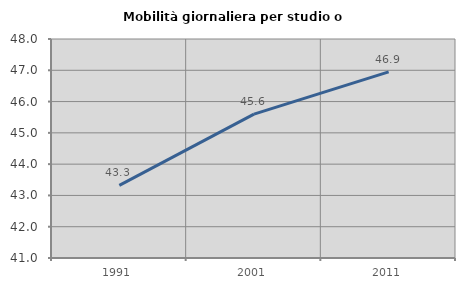
| Category | Mobilità giornaliera per studio o lavoro |
|---|---|
| 1991.0 | 43.322 |
| 2001.0 | 45.599 |
| 2011.0 | 46.947 |